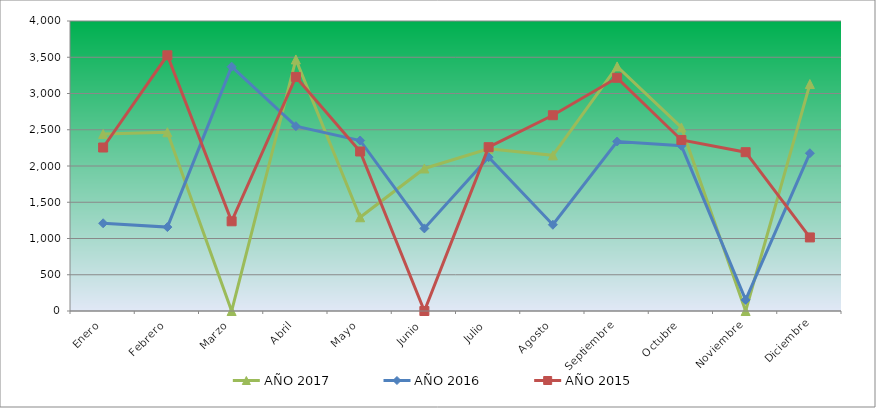
| Category | AÑO 2017 | AÑO 2016 | AÑO 2015 |
|---|---|---|---|
| Enero | 2442.007 | 1210.017 | 2255.021 |
| Febrero | 2465.33 | 1157.152 | 3527 |
| Marzo | 0 | 3370.118 | 1237.371 |
| Abril | 3469.581 | 2549.258 | 3228.625 |
| Mayo | 1293.071 | 2351.917 | 2200.091 |
| Junio | 1965.928 | 1139.53 | 0 |
| Julio | 2237.314 | 2122.195 | 2259.865 |
| Agosto | 2147.099 | 1189.458 | 2700.247 |
| Septiembre | 3373.425 | 2337.799 | 3216.536 |
| Octubre | 2531.622 | 2279.06 | 2359.099 |
| Noviembre | 0 | 153.148 | 2190.406 |
| Diciembre | 3130.198 | 2176.268 | 1014.76 |